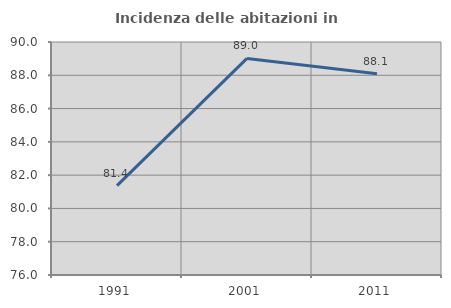
| Category | Incidenza delle abitazioni in proprietà  |
|---|---|
| 1991.0 | 81.369 |
| 2001.0 | 89.015 |
| 2011.0 | 88.087 |